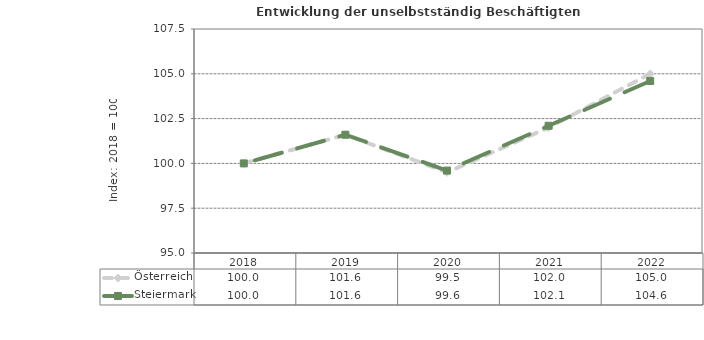
| Category | Österreich | Steiermark |
|---|---|---|
| 2022.0 | 105 | 104.6 |
| 2021.0 | 102 | 102.1 |
| 2020.0 | 99.5 | 99.6 |
| 2019.0 | 101.6 | 101.6 |
| 2018.0 | 100 | 100 |